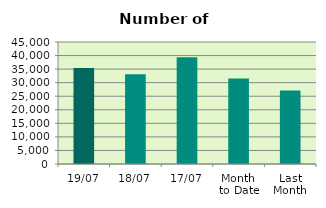
| Category | Series 0 |
|---|---|
| 19/07 | 35392 |
| 18/07 | 33078 |
| 17/07 | 39332 |
| Month 
to Date | 31509.067 |
| Last
Month | 27125.1 |